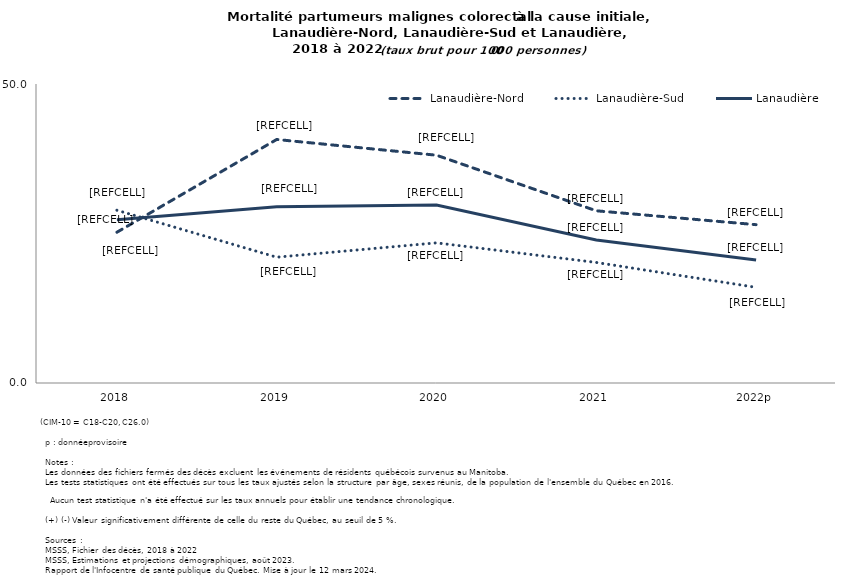
| Category | Lanaudière-Nord | Lanaudière-Sud | Lanaudière |
|---|---|---|---|
| 2018 | 25.21 | 28.887 | 27.311 |
| 2019 | 40.723 | 21.037 | 29.473 |
| 2020 | 38.09 | 23.437 | 29.745 |
| 2021 | 28.796 | 20.157 | 23.919 |
| 2022p | 26.475 | 15.997 | 20.578 |